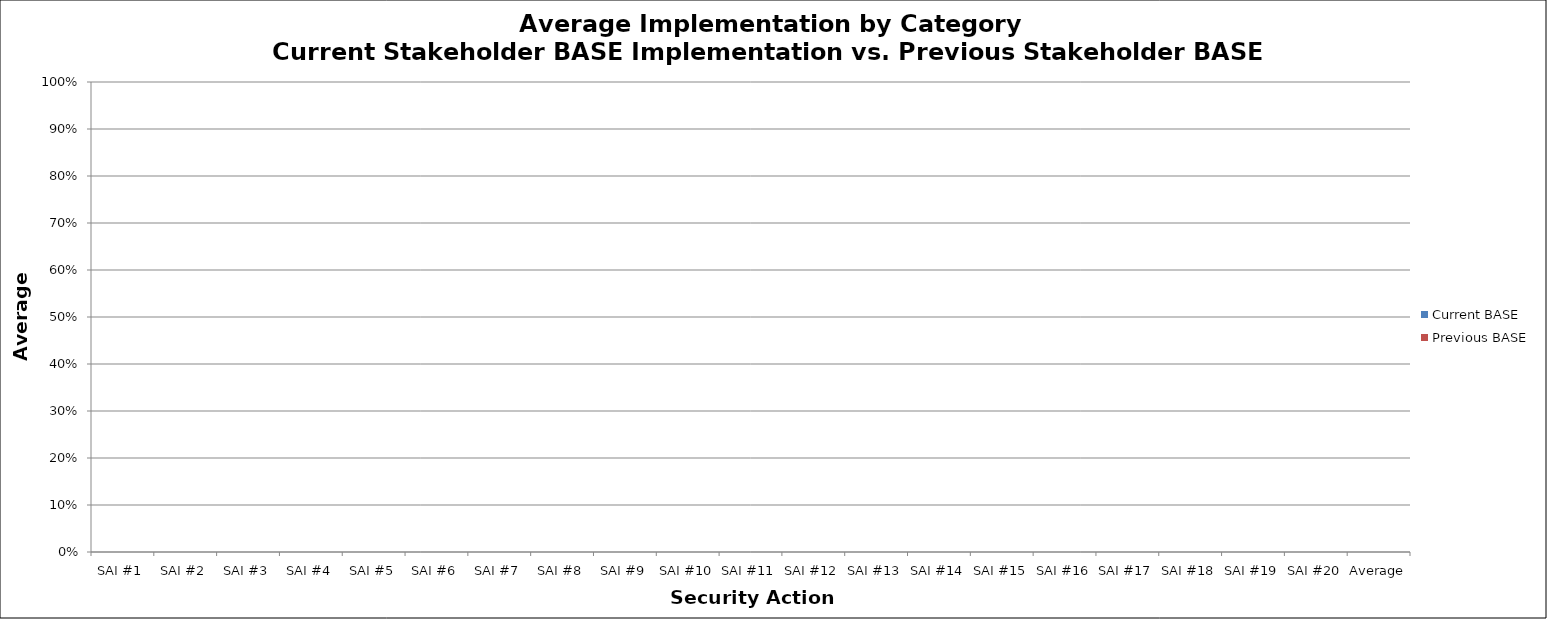
| Category | Current BASE | Previous BASE |
|---|---|---|
| SAI #1 | 0 | 0 |
| SAI #2 | 0 | 0 |
| SAI #3 | 0 | 0 |
| SAI #4 | 0 | 0 |
| SAI #5 | 0 | 0 |
| SAI #6 | 0 | 0 |
| SAI #7 | 0 | 0 |
| SAI #8 | 0 | 0 |
| SAI #9 | 0 | 0 |
| SAI #10 | 0 | 0 |
| SAI #11 | 0 | 0 |
| SAI #12 | 0 | 0 |
| SAI #13 | 0 | 0 |
| SAI #14 | 0 | 0 |
| SAI #15 | 0 | 0 |
| SAI #16 | 0 | 0 |
| SAI #17 | 0 | 0 |
| SAI #18 | 0 | 0 |
| SAI #19 | 0 | 0 |
| SAI #20 | 0 | 0 |
| Average | 0 | 0 |